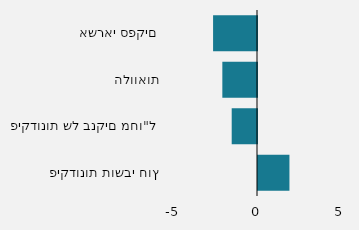
| Category | Series 0 |
|---|---|
| פיקדונות תושבי חוץ | 1894 |
| פיקדונות של בנקים מחו"ל | -1524 |
| הלוואות | -2088 |
| אשראי ספקים | -2646 |